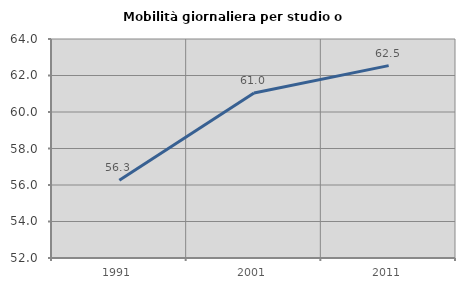
| Category | Mobilità giornaliera per studio o lavoro |
|---|---|
| 1991.0 | 56.255 |
| 2001.0 | 61.045 |
| 2011.0 | 62.54 |